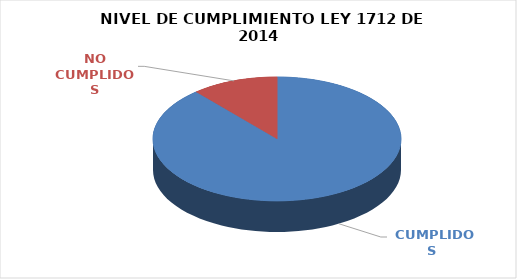
| Category | Series 0 |
|---|---|
|  CUMPLIDOS | 102 |
| NO CUMPLIDOS | 13 |